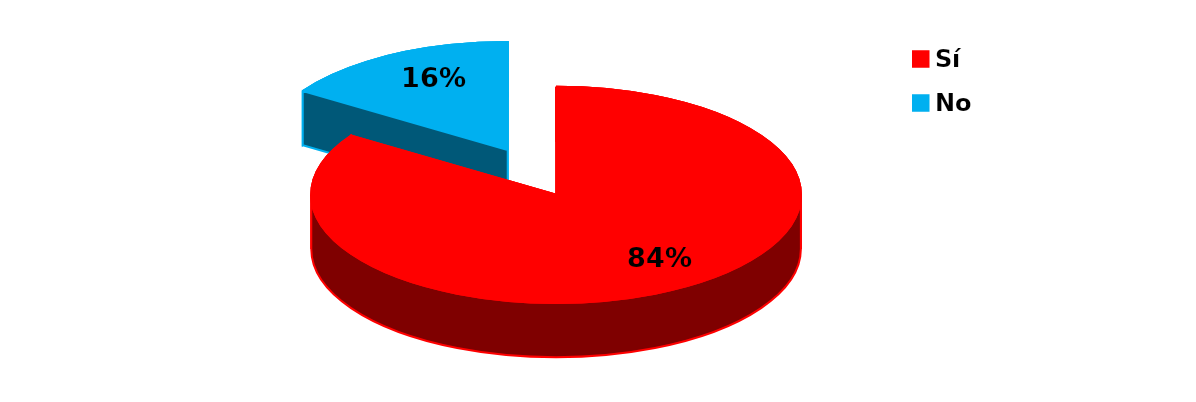
| Category | Series 0 |
|---|---|
| Sí | 16 |
| No | 3 |